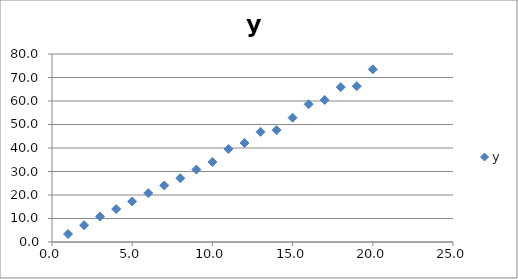
| Category | y |
|---|---|
| 1.0 | 3.392 |
| 2.0 | 7.15 |
| 3.0 | 10.828 |
| 4.0 | 14.013 |
| 5.0 | 17.246 |
| 6.0 | 20.817 |
| 7.0 | 24.062 |
| 8.0 | 27.134 |
| 9.0 | 30.821 |
| 10.0 | 34.047 |
| 11.0 | 39.567 |
| 12.0 | 42.146 |
| 13.0 | 46.882 |
| 14.0 | 47.586 |
| 15.0 | 52.899 |
| 16.0 | 58.622 |
| 17.0 | 60.439 |
| 18.0 | 65.902 |
| 19.0 | 66.309 |
| 20.0 | 73.481 |